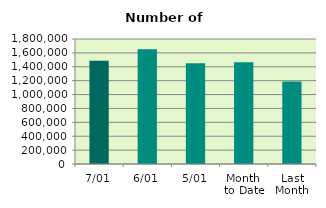
| Category | Series 0 |
|---|---|
| 7/01 | 1485610 |
| 6/01 | 1653494 |
| 5/01 | 1452502 |
| Month 
to Date | 1464462 |
| Last
Month | 1187425.652 |